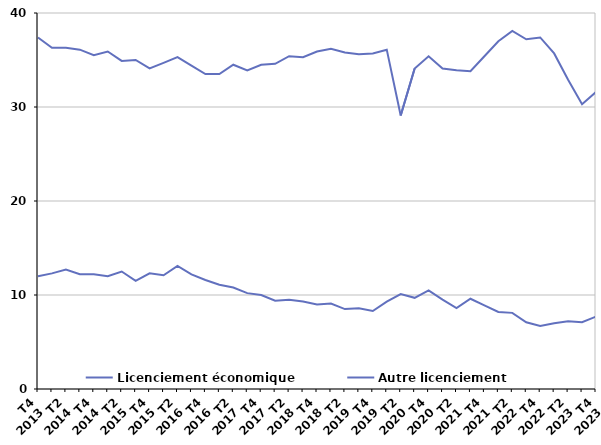
| Category | Licenciement économique | Autre licenciement |
|---|---|---|
| T4
2013 | 12 | 37.4 |
| T1
2014 | 12.3 | 36.3 |
| T2
2014 | 12.7 | 36.3 |
| T3
2014 | 12.2 | 36.1 |
| T4
2014 | 12.2 | 35.5 |
| T1
2015 | 12 | 35.9 |
| T2
2015 | 12.5 | 34.9 |
| T3
2015 | 11.5 | 35 |
| T4
2015 | 12.3 | 34.1 |
| T1
2016 | 12.1 | 34.7 |
| T2
2016 | 13.1 | 35.3 |
| T3
2016 | 12.2 | 34.4 |
| T4
2016 | 11.6 | 33.5 |
| T1
2017 | 11.1 | 33.5 |
| T2
2017 | 10.8 | 34.5 |
| T3
2017 | 10.2 | 33.9 |
| T4
2017 | 10 | 34.5 |
| T1
2018 | 9.4 | 34.6 |
| T2
2018 | 9.5 | 35.4 |
| T3
2018 | 9.3 | 35.3 |
| T4
2018 | 9 | 35.9 |
| T1
2019 | 9.1 | 36.2 |
| T2
2019 | 8.5 | 35.8 |
| T3
2019 | 8.6 | 35.6 |
| T4
2019 | 8.3 | 35.7 |
| T1
2020 | 9.3 | 36.1 |
| T2
2020 | 10.1 | 29.1 |
| T3
2020 | 9.7 | 34.1 |
| T4
2020 | 10.5 | 35.4 |
| T1
2021 | 9.5 | 34.1 |
| T2
2021 | 8.6 | 33.9 |
| T3
2021 | 9.6 | 33.8 |
| T4
2021 | 8.9 | 35.4 |
| T1
2022 | 8.2 | 37 |
| T2
2022 | 8.1 | 38.1 |
| T3
2022 | 7.1 | 37.2 |
| T4
2022 | 6.7 | 37.4 |
| T1
2023 | 7 | 35.7 |
| T2
2023 | 7.2 | 32.9 |
| T3
2023 | 7.1 | 30.3 |
| T4
2023 | 7.7 | 31.6 |